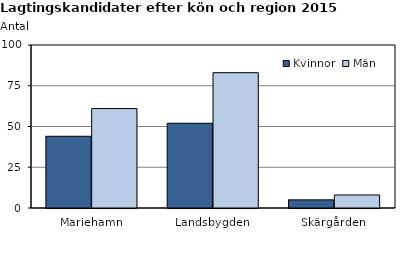
| Category | Kvinnor | Män |
|---|---|---|
| Mariehamn | 44 | 61 |
| Landsbygden | 52 | 83 |
| Skärgården | 5 | 8 |